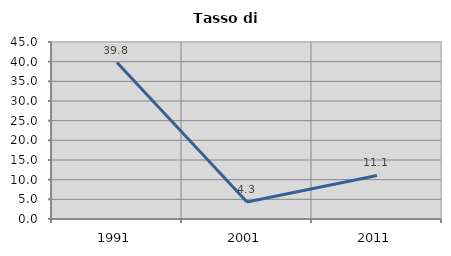
| Category | Tasso di disoccupazione   |
|---|---|
| 1991.0 | 39.763 |
| 2001.0 | 4.314 |
| 2011.0 | 11.064 |